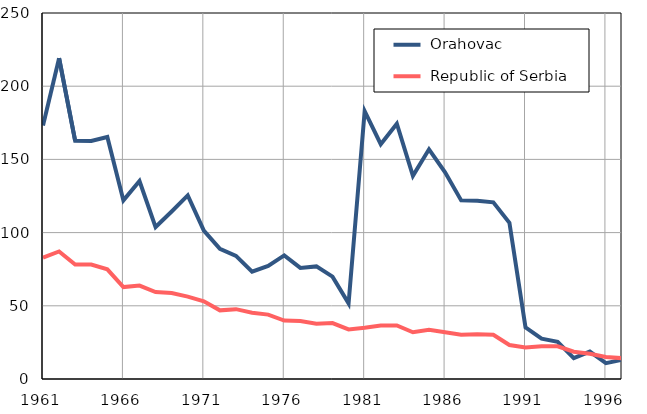
| Category |  Orahovac |  Republic of Serbia |
|---|---|---|
| 1961.0 | 173.1 | 82.9 |
| 1962.0 | 219.1 | 87.1 |
| 1963.0 | 162.7 | 78.2 |
| 1964.0 | 162.6 | 78.2 |
| 1965.0 | 165.3 | 74.9 |
| 1966.0 | 122 | 62.8 |
| 1967.0 | 135.2 | 63.8 |
| 1968.0 | 103.8 | 59.4 |
| 1969.0 | 114.4 | 58.7 |
| 1970.0 | 125.4 | 56.3 |
| 1971.0 | 101.3 | 53.1 |
| 1972.0 | 88.9 | 46.9 |
| 1973.0 | 84.1 | 47.7 |
| 1974.0 | 73.3 | 45.3 |
| 1975.0 | 77.3 | 44 |
| 1976.0 | 84.4 | 39.9 |
| 1977.0 | 75.9 | 39.6 |
| 1978.0 | 76.9 | 37.8 |
| 1979.0 | 69.9 | 38.2 |
| 1980.0 | 51.7 | 33.9 |
| 1981.0 | 183 | 35 |
| 1982.0 | 160.4 | 36.5 |
| 1983.0 | 174.4 | 36.6 |
| 1984.0 | 138.8 | 31.9 |
| 1985.0 | 156.9 | 33.7 |
| 1986.0 | 141.2 | 32 |
| 1987.0 | 122 | 30.2 |
| 1988.0 | 121.8 | 30.5 |
| 1989.0 | 120.7 | 30.2 |
| 1990.0 | 106.7 | 23.2 |
| 1991.0 | 35.3 | 21.6 |
| 1992.0 | 27.5 | 22.3 |
| 1993.0 | 25.4 | 22.3 |
| 1994.0 | 14.3 | 18.6 |
| 1995.0 | 18.7 | 17.2 |
| 1996.0 | 10.8 | 15.1 |
| 1997.0 | 13.1 | 14.2 |